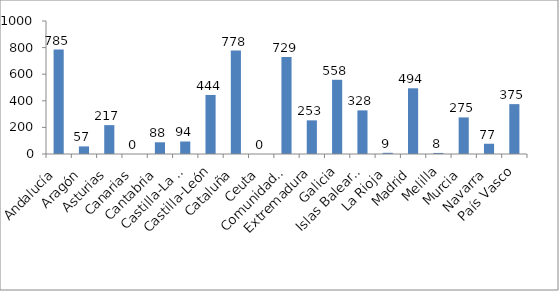
| Category | Series 0 |
|---|---|
| Andalucía | 785 |
| Aragón | 57 |
| Asturias | 217 |
| Canarias | 0 |
| Cantabria | 88 |
| Castilla-La Mancha | 94 |
| Castilla-León | 444 |
| Cataluña | 778 |
| Ceuta | 0 |
| Comunidad Valenciana | 729 |
| Extremadura | 253 |
| Galicia | 558 |
| Islas Baleares | 328 |
| La Rioja | 9 |
| Madrid | 494 |
| Melilla | 8 |
| Murcia | 275 |
| Navarra | 77 |
| País Vasco | 375 |